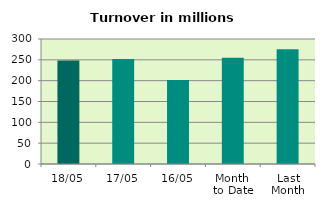
| Category | Series 0 |
|---|---|
| 18/05 | 248.495 |
| 17/05 | 252.074 |
| 16/05 | 201.363 |
| Month 
to Date | 254.869 |
| Last
Month | 275.481 |